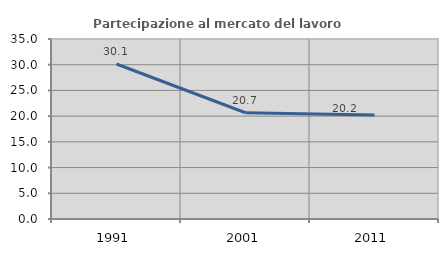
| Category | Partecipazione al mercato del lavoro  femminile |
|---|---|
| 1991.0 | 30.139 |
| 2001.0 | 20.656 |
| 2011.0 | 20.206 |